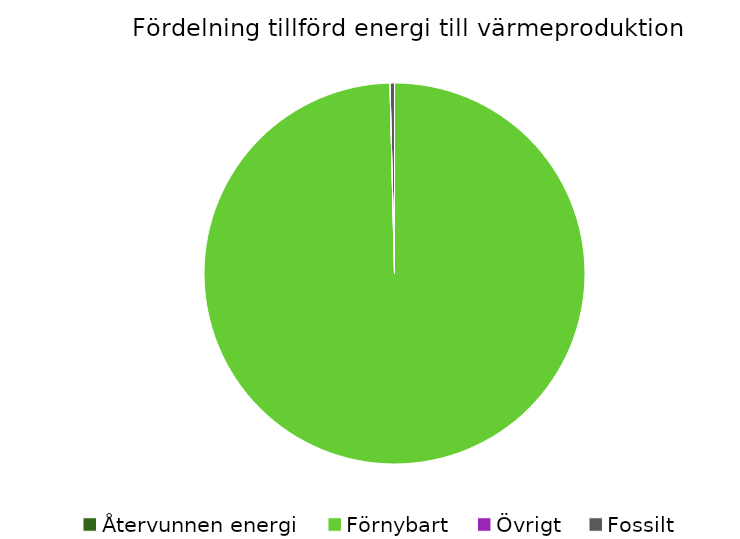
| Category | Fördelning värmeproduktion |
|---|---|
| Återvunnen energi | 0 |
| Förnybart | 0.996 |
| Övrigt | 0 |
| Fossilt | 0.004 |